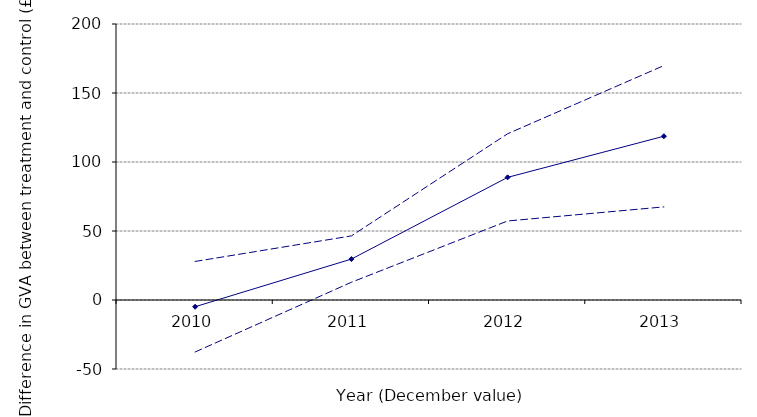
| Category | Series 0 | Series 1 | Series 2 |
|---|---|---|---|
| 2010.0 | -4.873 | -37.676 | 27.93 |
| 2011.0 | 29.645 | 12.844 | 46.446 |
| 2012.0 | 88.867 | 57.269 | 120.464 |
| 2013.0 | 118.674 | 67.469 | 169.879 |